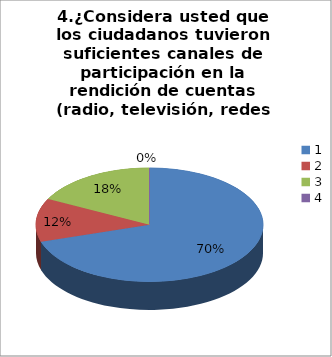
| Category | Series 0 |
|---|---|
| 0 | 40 |
| 1 | 7 |
| 2 | 10 |
| 3 | 0 |